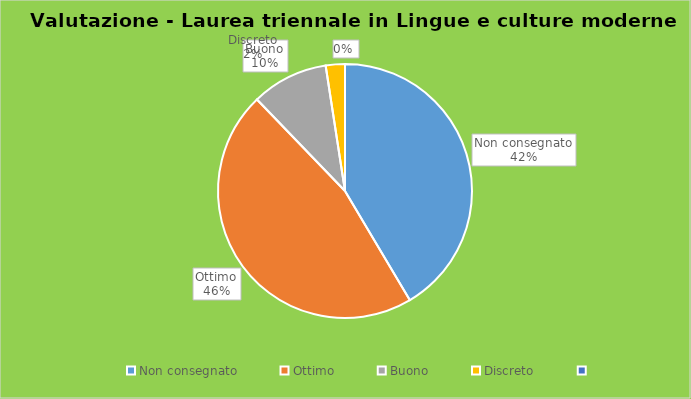
| Category | Series 0 |
|---|---|
| Non consegnato | 17 |
| Ottimo | 19 |
| Buono | 4 |
| Discreto | 1 |